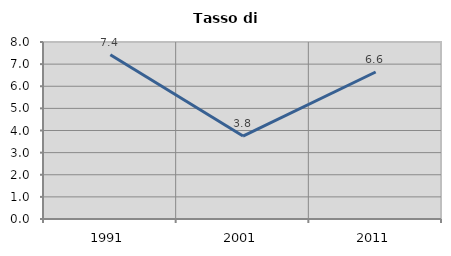
| Category | Tasso di disoccupazione   |
|---|---|
| 1991.0 | 7.42 |
| 2001.0 | 3.75 |
| 2011.0 | 6.644 |